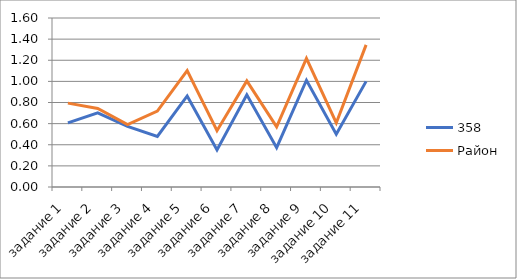
| Category | 358 | Район |
|---|---|---|
| задание 1 | 0.606 | 0.794 |
| задание 2 | 0.702 | 0.743 |
| задание 3 | 0.574 | 0.59 |
| задание 4 | 0.479 | 0.719 |
| задание 5 | 0.862 | 1.101 |
| задание 6 | 0.351 | 0.533 |
| задание 7 | 0.872 | 1.005 |
| задание 8 | 0.372 | 0.569 |
| задание 9 | 1.011 | 1.217 |
| задание 10 | 0.5 | 0.606 |
| задание 11 | 1 | 1.346 |